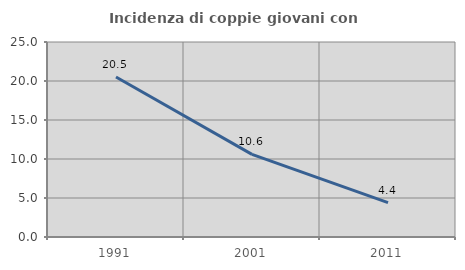
| Category | Incidenza di coppie giovani con figli |
|---|---|
| 1991.0 | 20.513 |
| 2001.0 | 10.588 |
| 2011.0 | 4.403 |